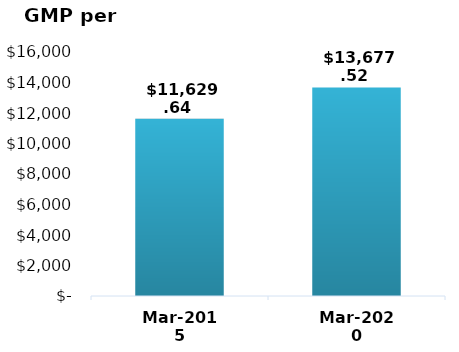
| Category | Graph |
|---|---|
| Mar-2015 | 11629.635 |
| Mar-2020 | 13677.519 |